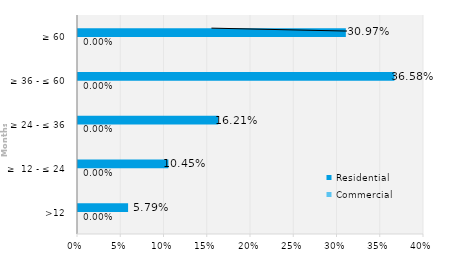
| Category | Commercial | Residential |
|---|---|---|
| >12 | 0 | 0.058 |
| ≥  12 - ≤ 24 | 0 | 0.104 |
| ≥ 24 - ≤ 36 | 0 | 0.162 |
| ≥ 36 - ≤ 60 | 0 | 0.366 |
| ≥ 60 | 0 | 0.31 |